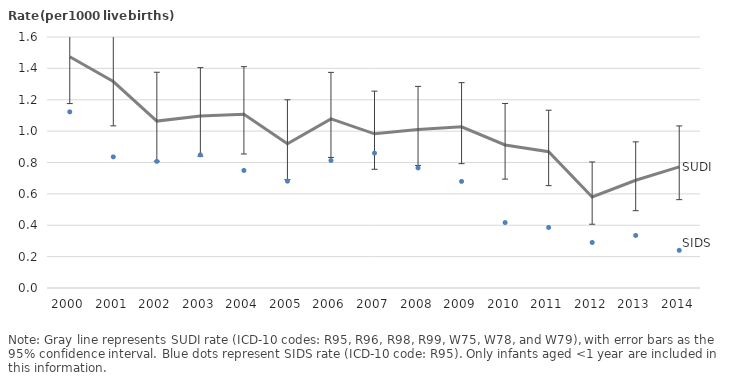
| Category | SUDI | SIDS |
|---|---|---|
| 2000.0 | 1.474 | 1.123 |
| 2001.0 | 1.316 | 0.836 |
| 2002.0 | 1.064 | 0.807 |
| 2003.0 | 1.096 | 0.848 |
| 2004.0 | 1.107 | 0.749 |
| 2005.0 | 0.92 | 0.681 |
| 2006.0 | 1.078 | 0.813 |
| 2007.0 | 0.983 | 0.86 |
| 2008.0 | 1.01 | 0.765 |
| 2009.0 | 1.027 | 0.679 |
| 2010.0 | 0.912 | 0.417 |
| 2011.0 | 0.869 | 0.386 |
| 2012.0 | 0.58 | 0.29 |
| 2013.0 | 0.687 | 0.335 |
| 2014.0 | 0.772 | 0.24 |